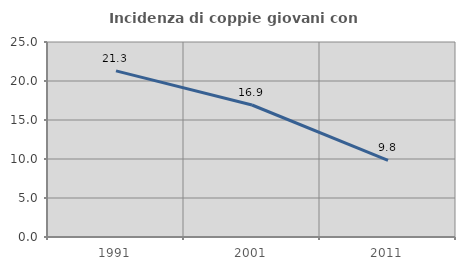
| Category | Incidenza di coppie giovani con figli |
|---|---|
| 1991.0 | 21.296 |
| 2001.0 | 16.923 |
| 2011.0 | 9.836 |